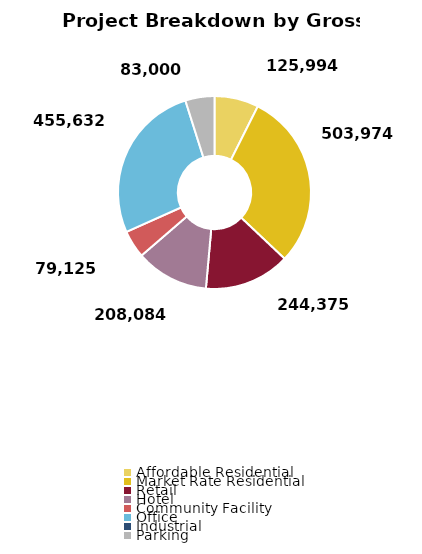
| Category | Series 0 |
|---|---|
| Affordable Residential | 125993.56 |
| Market Rate Residential | 503974.24 |
| Retail | 244375 |
| Hotel | 208084.2 |
| Community Facility | 79125 |
| Office | 455632 |
| Industrial | 0 |
| Parking | 83000 |